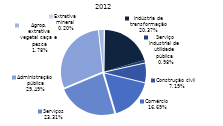
| Category | 2012 |
|---|---|
| Extrativa mineral | 1020 |
| Indústria de transformação | 102888 |
| Serviço industrial de utilidade pública | 4938 |
| Construção civil | 36302 |
| Comércio | 84329 |
| Serviços | 117748 |
| Administração pública | 148940 |
| Agrop. extrativa vegetal caça e pesca | 8967 |